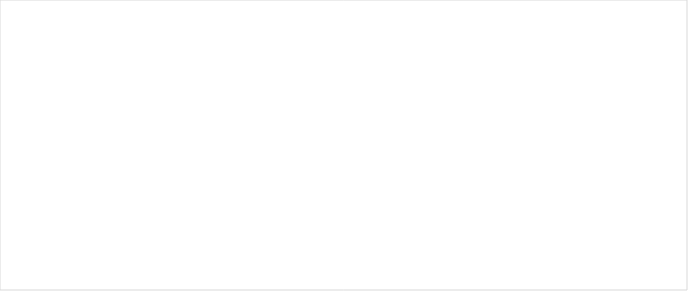
| Category | RESERVAS CONSTITUIDAS
 | CANCELACIONES RESERVAS PRESUPUESTALES
  | PAGOS
ACUMULADOS
 |
|---|---|---|---|
| A-FUNCIONAMIENTO | 2249.649 | 0 | 2200.209 |
| C-INVERSIÓN | 53197.266 | 0 | 36047.922 |